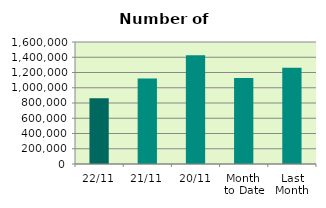
| Category | Series 0 |
|---|---|
| 22/11 | 860694 |
| 21/11 | 1122836 |
| 20/11 | 1426238 |
| Month 
to Date | 1128702.75 |
| Last
Month | 1260789.391 |